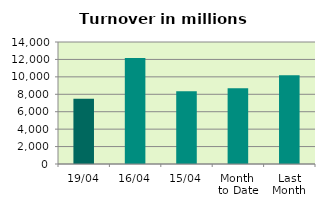
| Category | Series 0 |
|---|---|
| 19/04 | 7493.089 |
| 16/04 | 12155.729 |
| 15/04 | 8358.796 |
| Month 
to Date | 8681.853 |
| Last
Month | 10188.955 |